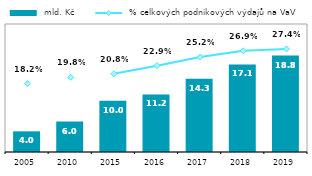
| Category |  mld. Kč |
|---|---|
| 2005.0 | 4.033 |
| 2010.0 | 5.956 |
| 2015.0 | 10 |
| 2016.0 | 11.234 |
| 2017.0 | 14.33 |
| 2018.0 | 17.101 |
| 2019.0 | 18.83 |